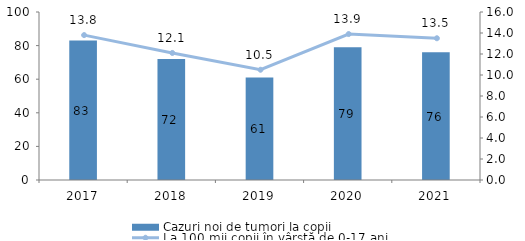
| Category | Cazuri noi de tumori la copii |
|---|---|
| 2017.0 | 83 |
| 2018.0 | 72 |
| 2019.0 | 61 |
| 2020.0 | 79 |
| 2021.0 | 76 |